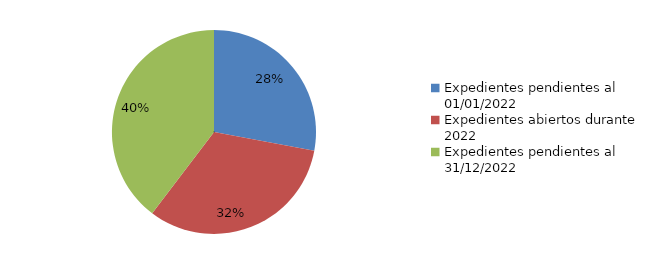
| Category | Series 0 |
|---|---|
| Expedientes pendientes al 01/01/2022 | 93 |
| Expedientes abiertos durante 2022 | 108 |
| Expedientes pendientes al 31/12/2022 | 132 |